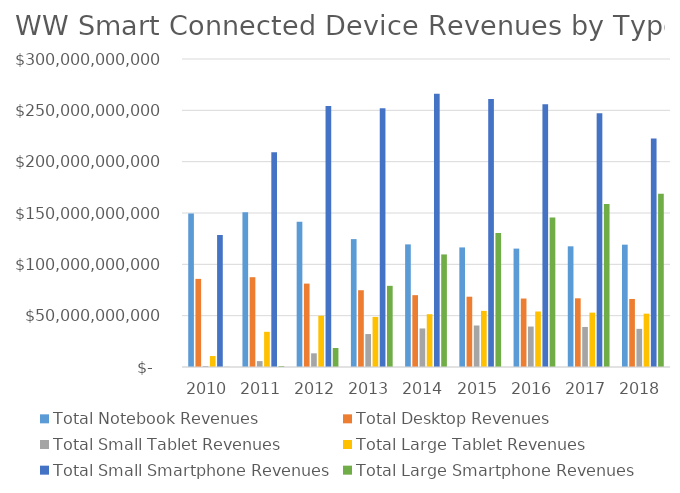
| Category | Total Notebook Revenues | Total Desktop Revenues | Total Small Tablet Revenues | Total Large Tablet Revenues | Total Small Smartphone Revenues | Total Large Smartphone Revenues |
|---|---|---|---|---|---|---|
| 2010.0 | 149411674896.42 | 85835552031.55 | 968038575.16 | 10666944109.53 | 128470682965.03 | 162914140.35 |
| 2011.0 | 150699007667.29 | 87464294833.66 | 5730194834.38 | 34285938969.48 | 209274034958.2 | 895034378.59 |
| 2012.0 | 141448456052.23 | 81234455178.58 | 13316575661.15 | 49901007068.88 | 254170130151.14 | 18504036348.05 |
| 2013.0 | 124568454608.91 | 74780879124.06 | 32107662260.62 | 48764455211.27 | 251987078025.01 | 79060247161.84 |
| 2014.0 | 119441213143.47 | 69969986291.4 | 37544067884.62 | 51433231575.54 | 266218122359.6 | 109649021232.29 |
| 2015.0 | 116474198482.03 | 68482734819.82 | 40419917283.38 | 54657165160.71 | 261024542152.03 | 130568801105.67 |
| 2016.0 | 115318842143.13 | 66701624153.59 | 39406289871.64 | 54059207243.34 | 255954771910.65 | 145506789067.74 |
| 2017.0 | 117553789809.28 | 66909653620.75 | 38997506349.67 | 52956418328.72 | 247085474635.68 | 158699384091.16 |
| 2018.0 | 119165285986.08 | 66269710866.52 | 37150307362.15 | 51963501074.45 | 222481492456.87 | 168669143582.69 |